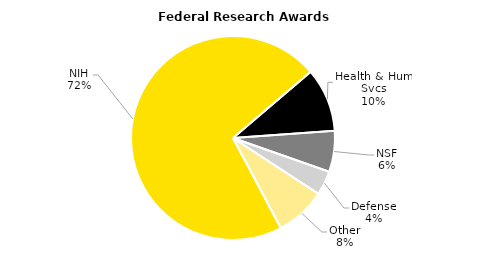
| Category | Series 0 |
|---|---|
| NIH | 163.378 |
| Health & Hum Svcs | 23.072 |
| NSF | 14.888 |
| Defense | 8.765 |
| Other | 18.286 |